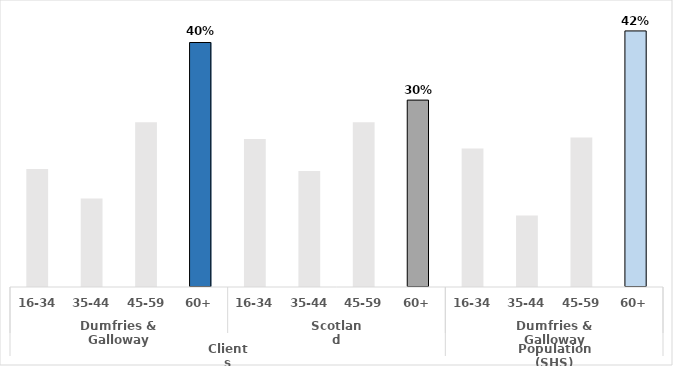
| Category | Series 0 |
|---|---|
| 0 | 0.192 |
| 1 | 0.144 |
| 2 | 0.267 |
| 3 | 0.397 |
| 4 | 0.24 |
| 5 | 0.188 |
| 6 | 0.268 |
| 7 | 0.304 |
| 8 | 0.225 |
| 9 | 0.116 |
| 10 | 0.243 |
| 11 | 0.416 |